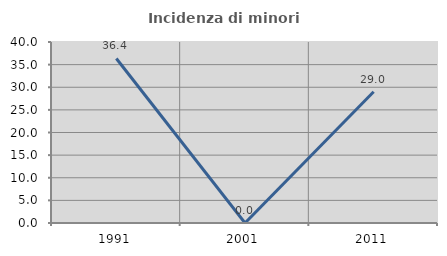
| Category | Incidenza di minori stranieri |
|---|---|
| 1991.0 | 36.364 |
| 2001.0 | 0 |
| 2011.0 | 28.992 |